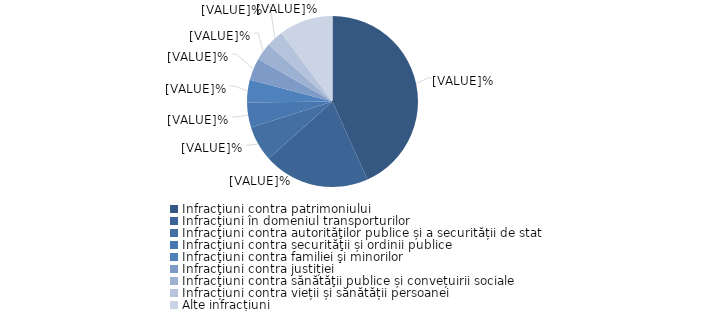
| Category | Series 0 |
|---|---|
| Infracţiuni contra patrimoniului | 43.3 |
| Infracţiuni în domeniul transporturilor | 20.1 |
| Infracţiuni contra autorităţilor publice și a securității de stat | 6.7 |
| Infracţiuni contra securităţii și ordinii publice  | 4.7 |
| Infracţiuni contra familiei şi minorilor | 4.3 |
| Infracţiuni contra justiției | 4.2 |
| Infracţiuni contra sănătăţii publice și convețuirii sociale | 3.3 |
| Infracțiuni contra vieții și sănătății persoanei | 3.2 |
| Alte infracțiuni | 10.2 |